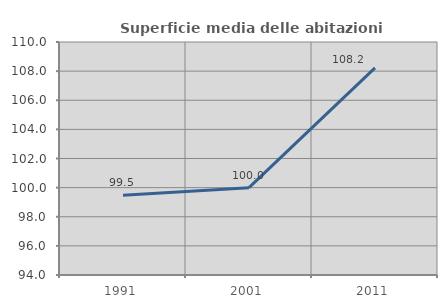
| Category | Superficie media delle abitazioni occupate |
|---|---|
| 1991.0 | 99.473 |
| 2001.0 | 100 |
| 2011.0 | 108.221 |